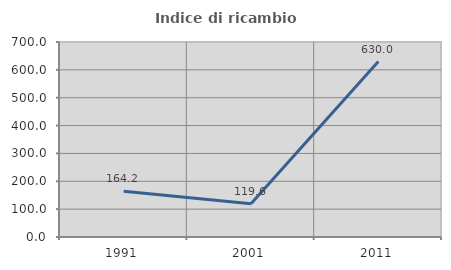
| Category | Indice di ricambio occupazionale  |
|---|---|
| 1991.0 | 164.151 |
| 2001.0 | 119.643 |
| 2011.0 | 630 |